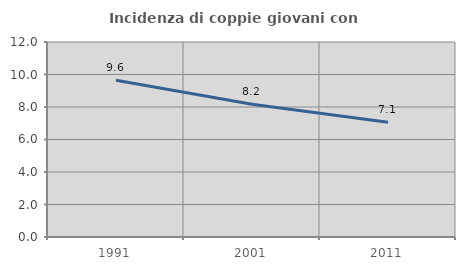
| Category | Incidenza di coppie giovani con figli |
|---|---|
| 1991.0 | 9.649 |
| 2001.0 | 8.163 |
| 2011.0 | 7.059 |